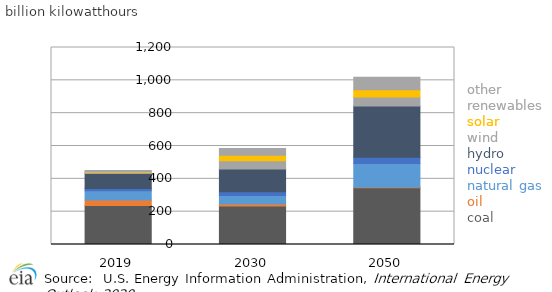
| Category | coal | oil | natural gas | nuclear | hydro | wind | solar | other renewables |
|---|---|---|---|---|---|---|---|---|
| 2019.0 | 237.136 | 33.434 | 57.134 | 12.933 | 92.099 | 6.668 | 5.96 | 4.78 |
| 2030.0 | 234.144 | 12.183 | 52.35 | 22.389 | 138.705 | 51.084 | 33.153 | 40.714 |
| 2050.0 | 345.93 | 2.915 | 144.894 | 37.824 | 312.179 | 55.294 | 44.265 | 75.211 |